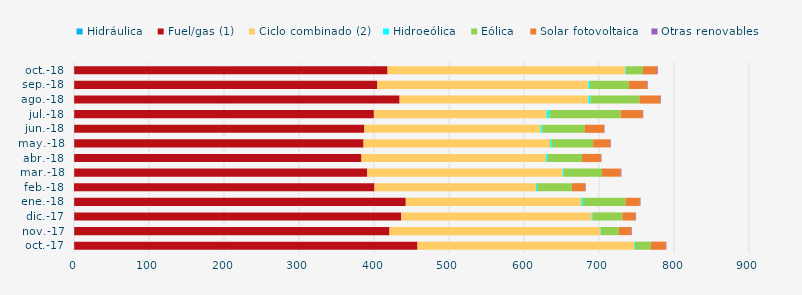
| Category | Hidráulica | Fuel/gas (1) | Ciclo combinado (2) | Hidroeólica | Eólica | Solar fotovoltaica | Otras renovables |
|---|---|---|---|---|---|---|---|
| oct.-17 | 0.294 | 457.69 | 288.991 | 0.971 | 21.33 | 19.755 | 0.831 |
| nov.-17 | 0.274 | 420.436 | 280.937 | 0.791 | 24.032 | 16.488 | 0.803 |
| dic.-17 | 0.311 | 436.048 | 253.67 | 1.286 | 39.81 | 17.54 | 0.782 |
| ene.-18 | 0.279 | 442.105 | 233.902 | 2.258 | 56.908 | 19.063 | 0.762 |
| feb.-18 | 0.034 | 400.679 | 215.217 | 1.754 | 46.207 | 17.867 | 0.647 |
| mar.-18 | 0.31 | 390.68 | 260.839 | 1.6 | 50.516 | 25.105 | 0.837 |
| abr.-18 | 0.276 | 383.044 | 246.338 | 2.263 | 45.549 | 25.191 | 0.539 |
| may.-18 | 0.308 | 385.794 | 248.617 | 2.034 | 55.352 | 23.051 | 0.751 |
| jun.-18 | 0.294 | 386.903 | 234.948 | 2.322 | 56.421 | 25.993 | 0.531 |
| jul.-18 | 0.296 | 399.578 | 230.146 | 3.716 | 95.158 | 29.45 | 0.702 |
| ago.-18 | 0.308 | 433.847 | 251.789 | 2.859 | 65.078 | 27.842 | 0.816 |
| sep.-18 | 0.288 | 404.236 | 281.475 | 2.166 | 51.688 | 24.19 | 0.783 |
| oct.-18 | 0.297 | 417.763 | 317.069 | 0.873 | 22.336 | 19.456 | 0.813 |